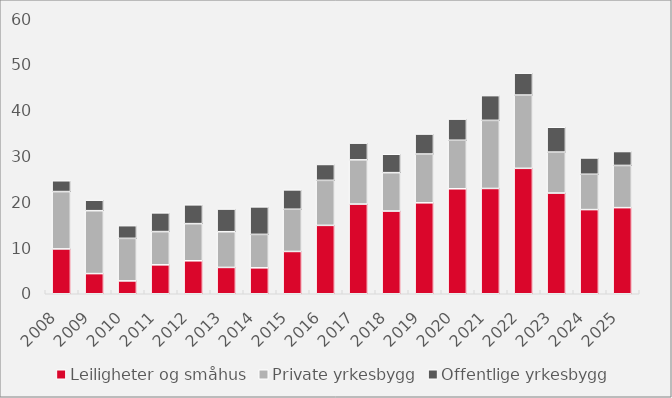
| Category | Leiligheter og småhus | Private yrkesbygg | Offentlige yrkesbygg |
|---|---|---|---|
| 2008.0 | 9.786 | 12.507 | 2.361 |
| 2009.0 | 4.395 | 13.729 | 2.293 |
| 2010.0 | 2.808 | 9.281 | 2.768 |
| 2011.0 | 6.312 | 7.252 | 4.082 |
| 2012.0 | 7.194 | 8.106 | 4.104 |
| 2013.0 | 5.743 | 7.792 | 4.948 |
| 2014.0 | 5.662 | 7.29 | 6.002 |
| 2015.0 | 9.228 | 9.211 | 4.221 |
| 2016.0 | 14.921 | 9.824 | 3.459 |
| 2017.0 | 19.567 | 9.648 | 3.651 |
| 2018.0 | 18.043 | 8.377 | 4.016 |
| 2019.0 | 19.843 | 10.642 | 4.359 |
| 2020.0 | 22.905 | 10.584 | 4.619 |
| 2021.0 | 22.972 | 14.857 | 5.404 |
| 2022.0 | 27.368 | 15.983 | 4.772 |
| 2023.0 | 21.97 | 8.94 | 5.417 |
| 2024.0 | 18.358 | 7.712 | 3.558 |
| 2025.0 | 18.785 | 9.209 | 3.036 |